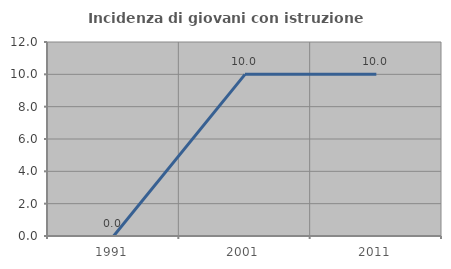
| Category | Incidenza di giovani con istruzione universitaria |
|---|---|
| 1991.0 | 0 |
| 2001.0 | 10 |
| 2011.0 | 10 |